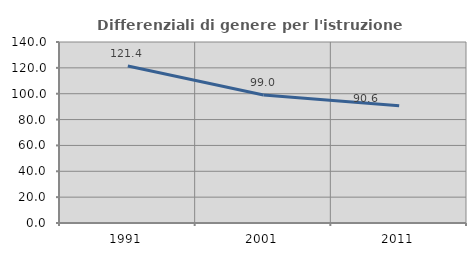
| Category | Differenziali di genere per l'istruzione superiore |
|---|---|
| 1991.0 | 121.421 |
| 2001.0 | 99.044 |
| 2011.0 | 90.646 |